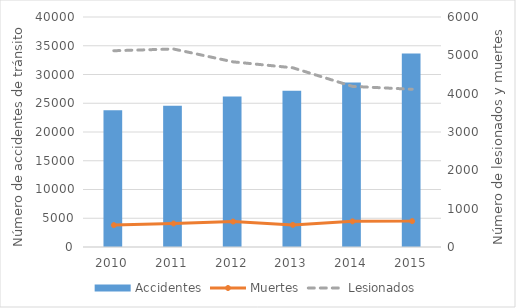
| Category | Accidentes |
|---|---|
| 2010.0 | 23797 |
| 2011.0 | 24573 |
| 2012.0 | 26164 |
| 2013.0 | 27170 |
| 2014.0 | 28587 |
| 2015.0 | 33673 |